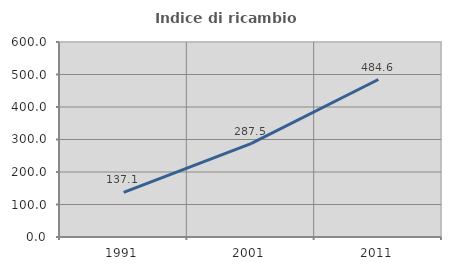
| Category | Indice di ricambio occupazionale  |
|---|---|
| 1991.0 | 137.143 |
| 2001.0 | 287.5 |
| 2011.0 | 484.615 |